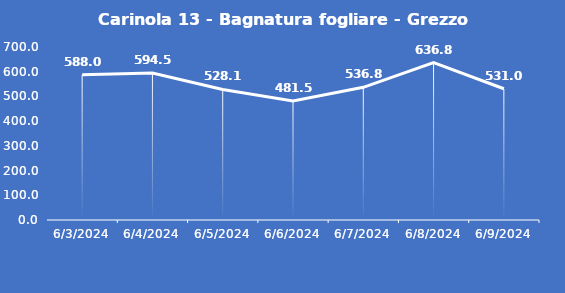
| Category | Carinola 13 - Bagnatura fogliare - Grezzo (min) |
|---|---|
| 6/3/24 | 588 |
| 6/4/24 | 594.5 |
| 6/5/24 | 528.1 |
| 6/6/24 | 481.5 |
| 6/7/24 | 536.8 |
| 6/8/24 | 636.8 |
| 6/9/24 | 531 |